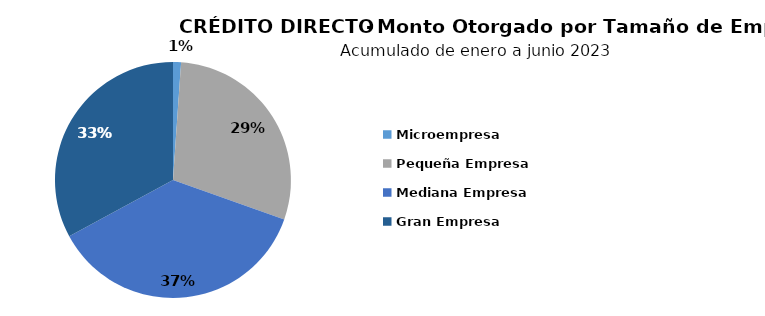
| Category | Monto |
|---|---|
| Microempresa | 0.279 |
| Pequeña Empresa | 7.449 |
| Mediana Empresa | 9.318 |
| Gran Empresa | 8.356 |